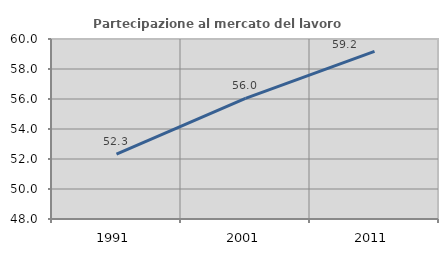
| Category | Partecipazione al mercato del lavoro  femminile |
|---|---|
| 1991.0 | 52.318 |
| 2001.0 | 56.039 |
| 2011.0 | 59.176 |